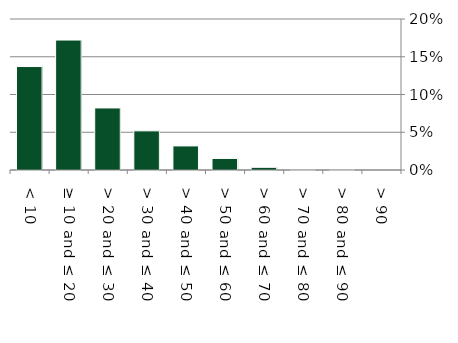
| Category | Native |
|---|---|
|  < 10 | 0.137 |
|  ≥ 10 and ≤ 20 | 0.172 |
|  > 20 and ≤ 30 | 0.082 |
|  > 30 and ≤ 40 | 0.052 |
|  > 40 and ≤ 50 | 0.032 |
|  > 50 and ≤ 60 | 0.015 |
|  > 60 and ≤ 70 | 0.004 |
|  > 70 and ≤ 80 | 0.001 |
|  > 80 and ≤ 90 | 0 |
|  > 90 | 0 |